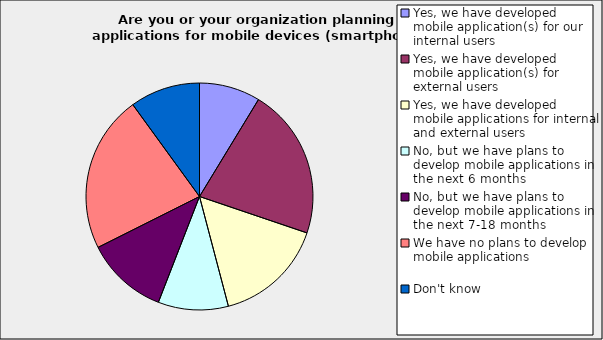
| Category | Series 0 |
|---|---|
| Yes, we have developed mobile application(s) for our internal users | 0.087 |
| Yes, we have developed mobile application(s) for external users | 0.215 |
| Yes, we have developed mobile applications for internal and external users | 0.157 |
| No, but we have plans to develop mobile applications in the next 6 months | 0.1 |
| No, but we have plans to develop mobile applications in the next 7-18 months | 0.117 |
| We have no plans to develop mobile applications | 0.224 |
| Don't know | 0.1 |